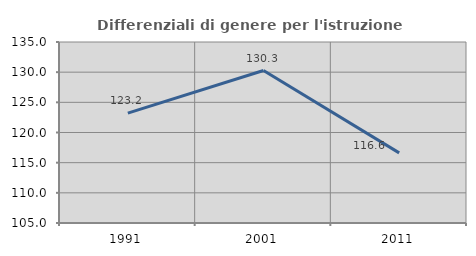
| Category | Differenziali di genere per l'istruzione superiore |
|---|---|
| 1991.0 | 123.214 |
| 2001.0 | 130.274 |
| 2011.0 | 116.627 |